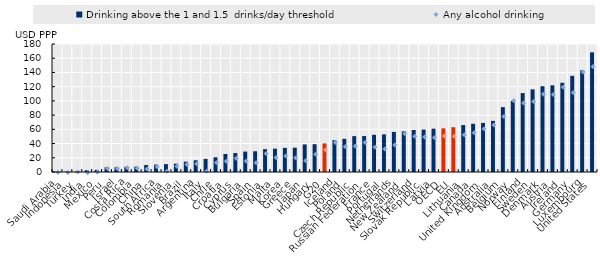
| Category | Drinking above the 1 and 1.5  drinks/day threshold |
|---|---|
| Saudi Arabia | 0.107 |
| Indonesia | 0.393 |
| Turkey | 0.978 |
| India | 2.452 |
| Mexico | 3.02 |
| Peru | 6.515 |
| Israel | 6.589 |
| Costa Rica | 7.308 |
| Colombia | 7.483 |
| China | 9.77 |
| South Africa | 10.362 |
| Romania | 11.067 |
| Slovenia | 11.65 |
| Brazil | 14.49 |
| Argentina | 16.468 |
| Italy | 18.458 |
| Chile | 20.684 |
| Croatia | 25.354 |
| Cyprus | 26.628 |
| Bulgaria | 28.723 |
| Spain | 29.144 |
| Estonia | 32.089 |
| Malta | 32.866 |
| Korea | 33.909 |
| Greece | 34.203 |
| Japan | 38.765 |
| Hungary | 39.116 |
| G20 | 40.229 |
| Iceland | 44.728 |
| Poland | 46.6 |
| Czech Republic | 50.448 |
| Russian Federation | 50.567 |
| France | 52.32 |
| Portugal | 52.877 |
| Netherlands | 56.353 |
| New Zealand | 57.172 |
| Switzerland | 59.121 |
| Slovak Republic | 59.677 |
| Latvia | 60.896 |
| OECD | 61.353 |
| EU | 62.933 |
| Lithuania | 66.003 |
| Canada | 67.81 |
| United Kingdom | 68.994 |
| Australia | 71.929 |
| Belgium | 91.238 |
| Norway | 100.109 |
| Finland | 111.026 |
| Sweden | 116.201 |
| Denmark | 120.623 |
| Austria | 121.862 |
| Ireland | 125.461 |
| Germany | 135.298 |
| Luxembourg | 143.008 |
| United States | 168.26 |